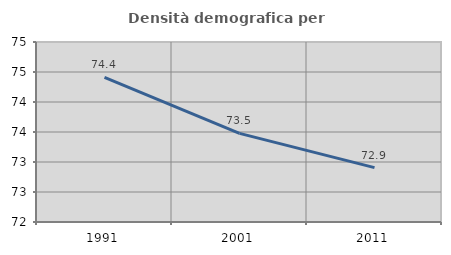
| Category | Densità demografica |
|---|---|
| 1991.0 | 74.412 |
| 2001.0 | 73.478 |
| 2011.0 | 72.907 |